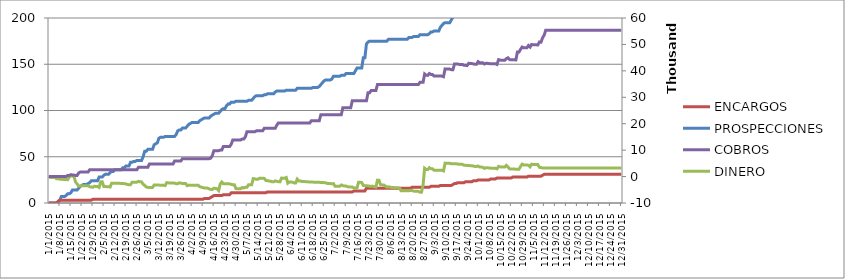
| Category | PROSPECCIONES | ENCARGOS |
|---|---|---|
| 1/1/15 | 0 | 0 |
| 1/2/15 | 0 | 0 |
| 1/3/15 | 0 | 0 |
| 1/4/15 | 0 | 0 |
| 1/5/15 | 0 | 0 |
| 1/6/15 | 0 | 0 |
| 1/7/15 | 1 | 2 |
| 1/8/15 | 3 | 3 |
| 1/9/15 | 7 | 3 |
| 1/10/15 | 7 | 3 |
| 1/11/15 | 7 | 3 |
| 1/12/15 | 8 | 3 |
| 1/13/15 | 10 | 3 |
| 1/14/15 | 10 | 3 |
| 1/15/15 | 11 | 3 |
| 1/16/15 | 14 | 3 |
| 1/17/15 | 14 | 3 |
| 1/18/15 | 14 | 3 |
| 1/19/15 | 14 | 3 |
| 1/20/15 | 16 | 3 |
| 1/21/15 | 18 | 3 |
| 1/22/15 | 19 | 3 |
| 1/23/15 | 20 | 3 |
| 1/24/15 | 20 | 3 |
| 1/25/15 | 20 | 3 |
| 1/26/15 | 21 | 3 |
| 1/27/15 | 22 | 3 |
| 1/28/15 | 24 | 3 |
| 1/29/15 | 24 | 4 |
| 1/30/15 | 24 | 4 |
| 1/31/15 | 24 | 4 |
| 2/1/15 | 24 | 4 |
| 2/2/15 | 28 | 4 |
| 2/3/15 | 28 | 4 |
| 2/4/15 | 28 | 4 |
| 2/5/15 | 30 | 4 |
| 2/6/15 | 31 | 4 |
| 2/7/15 | 31 | 4 |
| 2/8/15 | 31 | 4 |
| 2/9/15 | 33 | 4 |
| 2/10/15 | 34 | 4 |
| 2/11/15 | 34 | 4 |
| 2/12/15 | 36 | 4 |
| 2/13/15 | 36 | 4 |
| 2/14/15 | 36 | 4 |
| 2/15/15 | 36 | 4 |
| 2/16/15 | 36 | 4 |
| 2/17/15 | 38 | 4 |
| 2/18/15 | 38 | 4 |
| 2/19/15 | 40 | 4 |
| 2/20/15 | 40 | 4 |
| 2/21/15 | 40 | 4 |
| 2/22/15 | 44 | 4 |
| 2/23/15 | 44 | 4 |
| 2/24/15 | 45 | 4 |
| 2/25/15 | 45 | 4 |
| 2/26/15 | 46 | 4 |
| 2/27/15 | 46 | 4 |
| 2/28/15 | 46 | 4 |
| 3/1/15 | 46 | 4 |
| 3/2/15 | 50 | 4 |
| 3/3/15 | 56 | 4 |
| 3/4/15 | 56 | 4 |
| 3/5/15 | 58 | 4 |
| 3/6/15 | 58 | 4 |
| 3/7/15 | 58 | 4 |
| 3/8/15 | 58 | 4 |
| 3/9/15 | 63 | 4 |
| 3/10/15 | 64 | 4 |
| 3/11/15 | 65 | 4 |
| 3/12/15 | 70 | 4 |
| 3/13/15 | 71 | 4 |
| 3/14/15 | 71 | 4 |
| 3/15/15 | 71 | 4 |
| 3/16/15 | 72 | 4 |
| 3/17/15 | 72 | 4 |
| 3/18/15 | 72 | 4 |
| 3/19/15 | 72 | 4 |
| 3/20/15 | 72 | 4 |
| 3/21/15 | 72 | 4 |
| 3/22/15 | 72 | 4 |
| 3/23/15 | 74 | 4 |
| 3/24/15 | 78 | 4 |
| 3/25/15 | 79 | 4 |
| 3/26/15 | 79 | 4 |
| 3/27/15 | 81 | 4 |
| 3/28/15 | 81 | 4 |
| 3/29/15 | 81 | 4 |
| 3/30/15 | 83 | 4 |
| 3/31/15 | 85 | 4 |
| 4/1/15 | 86 | 4 |
| 4/2/15 | 87 | 4 |
| 4/3/15 | 87 | 4 |
| 4/4/15 | 87 | 4 |
| 4/5/15 | 87 | 4 |
| 4/6/15 | 87 | 4 |
| 4/7/15 | 89 | 4 |
| 4/8/15 | 90 | 4 |
| 4/9/15 | 91 | 4 |
| 4/10/15 | 92 | 5 |
| 4/11/15 | 92 | 5 |
| 4/12/15 | 92 | 5 |
| 4/13/15 | 92 | 5 |
| 4/14/15 | 94 | 6 |
| 4/15/15 | 95 | 7 |
| 4/16/15 | 96 | 8 |
| 4/17/15 | 97 | 8 |
| 4/18/15 | 97 | 8 |
| 4/19/15 | 97 | 8 |
| 4/20/15 | 99 | 8 |
| 4/21/15 | 101 | 8 |
| 4/22/15 | 102 | 9 |
| 4/23/15 | 102 | 9 |
| 4/24/15 | 105 | 9 |
| 4/25/15 | 107 | 9 |
| 4/26/15 | 107 | 9 |
| 4/27/15 | 109 | 11 |
| 4/28/15 | 109 | 11 |
| 4/29/15 | 109 | 11 |
| 4/30/15 | 110 | 11 |
| 5/1/15 | 110 | 11 |
| 5/2/15 | 110 | 11 |
| 5/3/15 | 110 | 11 |
| 5/4/15 | 110 | 11 |
| 5/5/15 | 110 | 11 |
| 5/6/15 | 110 | 11 |
| 5/7/15 | 110 | 11 |
| 5/8/15 | 111 | 11 |
| 5/9/15 | 111 | 11 |
| 5/10/15 | 111 | 11 |
| 5/11/15 | 113 | 11 |
| 5/12/15 | 115 | 11 |
| 5/13/15 | 116 | 11 |
| 5/14/15 | 116 | 11 |
| 5/15/15 | 116 | 11 |
| 5/16/15 | 116 | 11 |
| 5/17/15 | 116 | 11 |
| 5/18/15 | 117 | 11 |
| 5/19/15 | 117 | 11 |
| 5/20/15 | 118 | 12 |
| 5/21/15 | 118 | 12 |
| 5/22/15 | 118 | 12 |
| 5/23/15 | 118 | 12 |
| 5/24/15 | 118 | 12 |
| 5/25/15 | 120 | 12 |
| 5/26/15 | 121 | 12 |
| 5/27/15 | 121 | 12 |
| 5/28/15 | 121 | 12 |
| 5/29/15 | 121 | 12 |
| 5/30/15 | 121 | 12 |
| 5/31/15 | 121 | 12 |
| 6/1/15 | 122 | 12 |
| 6/2/15 | 122 | 12 |
| 6/3/15 | 122 | 12 |
| 6/4/15 | 122 | 12 |
| 6/5/15 | 122 | 12 |
| 6/6/15 | 122 | 12 |
| 6/7/15 | 122 | 12 |
| 6/8/15 | 124 | 12 |
| 6/9/15 | 124 | 12 |
| 6/10/15 | 124 | 12 |
| 6/11/15 | 124 | 12 |
| 6/12/15 | 124 | 12 |
| 6/13/15 | 124 | 12 |
| 6/14/15 | 124 | 12 |
| 6/15/15 | 124 | 12 |
| 6/16/15 | 124 | 12 |
| 6/17/15 | 124 | 12 |
| 6/18/15 | 125 | 12 |
| 6/19/15 | 125 | 12 |
| 6/20/15 | 125 | 12 |
| 6/21/15 | 125 | 12 |
| 6/22/15 | 126 | 12 |
| 6/23/15 | 128 | 12 |
| 6/24/15 | 130 | 12 |
| 6/25/15 | 132 | 12 |
| 6/26/15 | 133 | 12 |
| 6/27/15 | 133 | 12 |
| 6/28/15 | 133 | 12 |
| 6/29/15 | 133 | 12 |
| 6/30/15 | 134 | 12 |
| 7/1/15 | 137 | 12 |
| 7/2/15 | 137 | 12 |
| 7/3/15 | 137 | 12 |
| 7/4/15 | 137 | 12 |
| 7/5/15 | 137 | 12 |
| 7/6/15 | 138 | 12 |
| 7/7/15 | 138 | 12 |
| 7/8/15 | 138 | 12 |
| 7/9/15 | 140 | 12 |
| 7/10/15 | 140 | 12 |
| 7/11/15 | 140 | 12 |
| 7/12/15 | 140 | 12 |
| 7/13/15 | 140 | 12 |
| 7/14/15 | 140 | 13 |
| 7/15/15 | 143 | 13 |
| 7/16/15 | 146 | 13 |
| 7/17/15 | 146 | 13 |
| 7/18/15 | 146 | 13 |
| 7/19/15 | 146 | 13 |
| 7/20/15 | 157 | 13 |
| 7/21/15 | 157 | 13 |
| 7/22/15 | 172 | 16 |
| 7/23/15 | 174 | 16 |
| 7/24/15 | 175 | 16 |
| 7/25/15 | 175 | 16 |
| 7/26/15 | 175 | 16 |
| 7/27/15 | 175 | 16 |
| 7/28/15 | 175 | 16 |
| 7/29/15 | 175 | 16 |
| 7/30/15 | 175 | 16 |
| 7/31/15 | 175 | 16 |
| 8/1/15 | 175 | 16 |
| 8/2/15 | 175 | 16 |
| 8/3/15 | 175 | 16 |
| 8/4/15 | 175 | 16 |
| 8/5/15 | 177 | 16 |
| 8/6/15 | 177 | 16 |
| 8/7/15 | 177 | 16 |
| 8/8/15 | 177 | 16 |
| 8/9/15 | 177 | 16 |
| 8/10/15 | 177 | 16 |
| 8/11/15 | 177 | 16 |
| 8/12/15 | 177 | 16 |
| 8/13/15 | 177 | 16 |
| 8/14/15 | 177 | 16 |
| 8/15/15 | 177 | 16 |
| 8/16/15 | 177 | 16 |
| 8/17/15 | 177 | 16 |
| 8/18/15 | 179 | 16 |
| 8/19/15 | 179 | 16 |
| 8/20/15 | 179 | 17 |
| 8/21/15 | 180 | 17 |
| 8/22/15 | 180 | 17 |
| 8/23/15 | 180 | 17 |
| 8/24/15 | 180 | 17 |
| 8/25/15 | 182 | 17 |
| 8/26/15 | 182 | 17 |
| 8/27/15 | 182 | 17 |
| 8/28/15 | 182 | 17 |
| 8/29/15 | 182 | 17 |
| 8/30/15 | 182 | 17 |
| 8/31/15 | 183 | 17 |
| 9/1/15 | 185 | 18 |
| 9/2/15 | 185 | 18 |
| 9/3/15 | 186 | 18 |
| 9/4/15 | 186 | 18 |
| 9/5/15 | 186 | 18 |
| 9/6/15 | 186 | 18 |
| 9/7/15 | 190 | 19 |
| 9/8/15 | 192 | 19 |
| 9/9/15 | 194 | 19 |
| 9/10/15 | 195 | 19 |
| 9/11/15 | 195 | 19 |
| 9/12/15 | 195 | 19 |
| 9/13/15 | 195 | 19 |
| 9/14/15 | 198 | 19 |
| 9/15/15 | 201 | 20 |
| 9/16/15 | 204 | 21 |
| 9/17/15 | 206 | 21 |
| 9/18/15 | 206 | 22 |
| 9/19/15 | 206 | 22 |
| 9/20/15 | 206 | 22 |
| 9/21/15 | 206 | 22 |
| 9/22/15 | 207 | 22 |
| 9/23/15 | 209 | 23 |
| 9/24/15 | 210 | 23 |
| 9/25/15 | 212 | 23 |
| 9/26/15 | 212 | 23 |
| 9/27/15 | 212 | 23 |
| 9/28/15 | 215 | 24 |
| 9/29/15 | 216 | 24 |
| 9/30/15 | 217 | 24 |
| 10/1/15 | 218 | 25 |
| 10/2/15 | 219 | 25 |
| 10/3/15 | 219 | 25 |
| 10/4/15 | 219 | 25 |
| 10/5/15 | 219 | 25 |
| 10/6/15 | 220 | 25 |
| 10/7/15 | 222 | 25 |
| 10/8/15 | 222 | 25 |
| 10/9/15 | 222 | 26 |
| 10/10/15 | 222 | 26 |
| 10/11/15 | 222 | 26 |
| 10/12/15 | 222 | 26 |
| 10/13/15 | 222 | 27 |
| 10/14/15 | 222 | 27 |
| 10/15/15 | 224 | 27 |
| 10/16/15 | 224 | 27 |
| 10/17/15 | 224 | 27 |
| 10/18/15 | 224 | 27 |
| 10/19/15 | 227 | 27 |
| 10/20/15 | 229 | 27 |
| 10/21/15 | 233 | 27 |
| 10/22/15 | 233 | 27 |
| 10/23/15 | 235 | 28 |
| 10/24/15 | 235 | 28 |
| 10/25/15 | 235 | 28 |
| 10/26/15 | 235 | 28 |
| 10/27/15 | 235 | 28 |
| 10/28/15 | 236 | 28 |
| 10/29/15 | 236 | 28 |
| 10/30/15 | 237 | 28 |
| 10/31/15 | 237 | 28 |
| 11/1/15 | 237 | 28 |
| 11/2/15 | 237 | 29 |
| 11/3/15 | 239 | 29 |
| 11/4/15 | 240 | 29 |
| 11/5/15 | 240 | 29 |
| 11/6/15 | 241 | 29 |
| 11/7/15 | 241 | 29 |
| 11/8/15 | 241 | 29 |
| 11/9/15 | 241 | 29 |
| 11/10/15 | 241 | 29 |
| 11/11/15 | 242 | 30 |
| 11/12/15 | 242 | 31 |
| 11/13/15 | 242 | 31 |
| 11/14/15 | 242 | 31 |
| 11/15/15 | 242 | 31 |
| 11/16/15 | 242 | 31 |
| 11/17/15 | 242 | 31 |
| 11/18/15 | 242 | 31 |
| 11/19/15 | 242 | 31 |
| 11/20/15 | 242 | 31 |
| 11/21/15 | 242 | 31 |
| 11/22/15 | 242 | 31 |
| 11/23/15 | 242 | 31 |
| 11/24/15 | 242 | 31 |
| 11/25/15 | 242 | 31 |
| 11/26/15 | 242 | 31 |
| 11/27/15 | 242 | 31 |
| 11/28/15 | 242 | 31 |
| 11/29/15 | 242 | 31 |
| 11/30/15 | 242 | 31 |
| 12/1/15 | 242 | 31 |
| 12/2/15 | 242 | 31 |
| 12/3/15 | 242 | 31 |
| 12/4/15 | 242 | 31 |
| 12/5/15 | 242 | 31 |
| 12/6/15 | 242 | 31 |
| 12/7/15 | 242 | 31 |
| 12/8/15 | 242 | 31 |
| 12/9/15 | 242 | 31 |
| 12/10/15 | 242 | 31 |
| 12/11/15 | 242 | 31 |
| 12/12/15 | 242 | 31 |
| 12/13/15 | 242 | 31 |
| 12/14/15 | 242 | 31 |
| 12/15/15 | 242 | 31 |
| 12/16/15 | 242 | 31 |
| 12/17/15 | 242 | 31 |
| 12/18/15 | 242 | 31 |
| 12/19/15 | 242 | 31 |
| 12/20/15 | 242 | 31 |
| 12/21/15 | 242 | 31 |
| 12/22/15 | 242 | 31 |
| 12/23/15 | 242 | 31 |
| 12/24/15 | 242 | 31 |
| 12/25/15 | 242 | 31 |
| 12/26/15 | 242 | 31 |
| 12/27/15 | 242 | 31 |
| 12/28/15 | 242 | 31 |
| 12/29/15 | 242 | 31 |
| 12/30/15 | 242 | 31 |
| 12/31/15 | 242 | 31 |